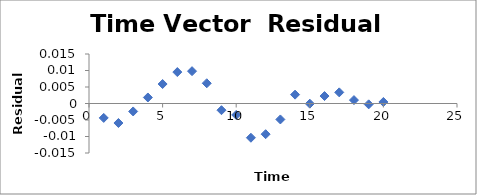
| Category | Series 0 |
|---|---|
| 1.0 | -0.004 |
| 2.0 | -0.006 |
| 3.0 | -0.002 |
| 4.0 | 0.002 |
| 5.0 | 0.006 |
| 6.0 | 0.01 |
| 7.0 | 0.01 |
| 8.0 | 0.006 |
| 9.0 | -0.002 |
| 10.0 | -0.003 |
| 11.0 | -0.01 |
| 12.0 | -0.009 |
| 13.0 | -0.005 |
| 14.0 | 0.003 |
| 15.0 | 0 |
| 16.0 | 0.002 |
| 17.0 | 0.003 |
| 18.0 | 0.001 |
| 19.0 | 0 |
| 20.0 | 0 |